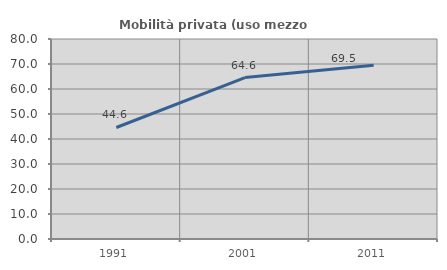
| Category | Mobilità privata (uso mezzo privato) |
|---|---|
| 1991.0 | 44.605 |
| 2001.0 | 64.589 |
| 2011.0 | 69.531 |